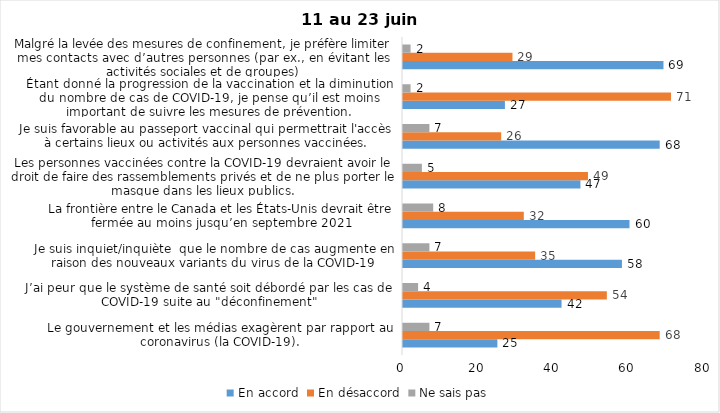
| Category | En accord | En désaccord | Ne sais pas |
|---|---|---|---|
| Le gouvernement et les médias exagèrent par rapport au coronavirus (la COVID-19). | 25 | 68 | 7 |
| J’ai peur que le système de santé soit débordé par les cas de COVID-19 suite au "déconfinement" | 42 | 54 | 4 |
| Je suis inquiet/inquiète  que le nombre de cas augmente en raison des nouveaux variants du virus de la COVID-19 | 58 | 35 | 7 |
| La frontière entre le Canada et les États-Unis devrait être fermée au moins jusqu’en septembre 2021 | 60 | 32 | 8 |
| Les personnes vaccinées contre la COVID-19 devraient avoir le droit de faire des rassemblements privés et de ne plus porter le masque dans les lieux publics. | 47 | 49 | 5 |
| Je suis favorable au passeport vaccinal qui permettrait l'accès à certains lieux ou activités aux personnes vaccinées. | 68 | 26 | 7 |
| Étant donné la progression de la vaccination et la diminution du nombre de cas de COVID-19, je pense qu’il est moins important de suivre les mesures de prévention. | 27 | 71 | 2 |
| Malgré la levée des mesures de confinement, je préfère limiter mes contacts avec d’autres personnes (par ex., en évitant les activités sociales et de groupes) | 69 | 29 | 2 |